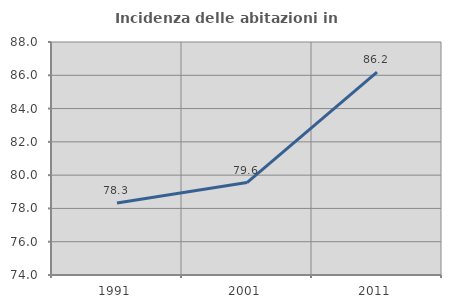
| Category | Incidenza delle abitazioni in proprietà  |
|---|---|
| 1991.0 | 78.32 |
| 2001.0 | 79.556 |
| 2011.0 | 86.184 |